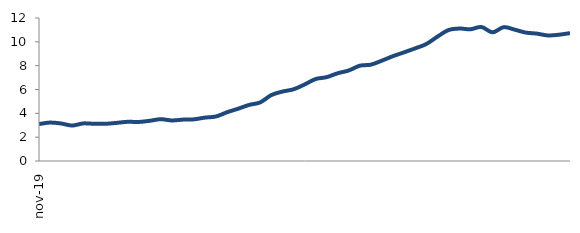
| Category | Series 0 |
|---|---|
| 2019-11-01 | 3.095 |
| 2019-12-01 | 3.225 |
| 2020-01-01 | 3.148 |
| 2020-02-01 | 2.975 |
| 2020-03-01 | 3.153 |
| 2020-04-01 | 3.122 |
| 2020-05-01 | 3.123 |
| 2020-06-01 | 3.198 |
| 2020-07-01 | 3.289 |
| 2020-08-01 | 3.275 |
| 2020-09-01 | 3.372 |
| 2020-10-01 | 3.508 |
| 2020-11-01 | 3.402 |
| 2020-12-01 | 3.472 |
| 2021-01-01 | 3.496 |
| 2021-02-01 | 3.642 |
| 2021-03-01 | 3.737 |
| 2021-04-01 | 4.091 |
| 2021-05-01 | 4.388 |
| 2021-06-01 | 4.708 |
| 2021-07-01 | 4.92 |
| 2021-08-01 | 5.531 |
| 2021-09-01 | 5.826 |
| 2021-10-01 | 6.015 |
| 2021-11-01 | 6.418 |
| 2021-12-01 | 6.877 |
| 2022-01-01 | 7.036 |
| 2022-02-01 | 7.363 |
| 2022-03-01 | 7.597 |
| 2022-04-01 | 7.997 |
| 2022-05-01 | 8.085 |
| 2022-06-01 | 8.423 |
| 2022-07-01 | 8.799 |
| 2022-08-01 | 9.118 |
| 2022-09-01 | 9.453 |
| 2022-10-01 | 9.809 |
| 2022-11-01 | 10.425 |
| 2022-12-01 | 10.982 |
| 2023-01-01 | 11.115 |
| 2023-02-01 | 11.054 |
| 2023-03-01 | 11.245 |
| 2023-04-01 | 10.801 |
| 2023-05-01 | 11.231 |
| 2023-06-01 | 11.022 |
| 2023-07-01 | 10.776 |
| 2023-08-01 | 10.689 |
| 2023-09-01 | 10.536 |
| 2023-10-01 | 10.597 |
| 2023-11-01 | 10.731 |